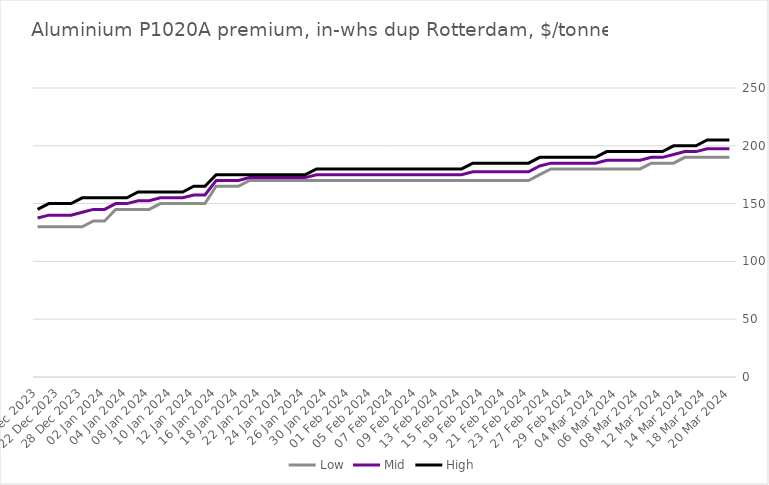
| Category | Low | Mid | High |
|---|---|---|---|
| 20 Mar 2024 | 190 | 197.5 | 205 |
| 19 Mar 2024 | 190 | 197.5 | 205 |
| 18 Mar 2024 | 190 | 197.5 | 205 |
| 15 Mar 2024 | 190 | 195 | 200 |
| 14 Mar 2024 | 190 | 195 | 200 |
| 13 Mar 2024 | 185 | 192.5 | 200 |
| 12 Mar 2024 | 185 | 190 | 195 |
| 11 Mar 2024 | 185 | 190 | 195 |
| 08 Mar 2024 | 180 | 187.5 | 195 |
| 07 Mar 2024 | 180 | 187.5 | 195 |
| 06 Mar 2024 | 180 | 187.5 | 195 |
| 05 Mar 2024 | 180 | 187.5 | 195 |
| 04 Mar 2024 | 180 | 185 | 190 |
| 01 Mar 2024 | 180 | 185 | 190 |
| 29 Feb 2024 | 180 | 185 | 190 |
| 28 Feb 2024 | 180 | 185 | 190 |
| 27 Feb 2024 | 180 | 185 | 190 |
| 26 Feb 2024 | 175 | 182.5 | 190 |
| 23 Feb 2024 | 170 | 177.5 | 185 |
| 22 Feb 2024 | 170 | 177.5 | 185 |
| 21 Feb 2024 | 170 | 177.5 | 185 |
| 20 Feb 2024 | 170 | 177.5 | 185 |
| 19 Feb 2024 | 170 | 177.5 | 185 |
| 16 Feb 2024 | 170 | 177.5 | 185 |
| 15 Feb 2024 | 170 | 175 | 180 |
| 14 Feb 2024 | 170 | 175 | 180 |
| 13 Feb 2024 | 170 | 175 | 180 |
| 12 Feb 2024 | 170 | 175 | 180 |
| 09 Feb 2024 | 170 | 175 | 180 |
| 08 Feb 2024 | 170 | 175 | 180 |
| 07 Feb 2024 | 170 | 175 | 180 |
| 06 Feb 2024 | 170 | 175 | 180 |
| 05 Feb 2024 | 170 | 175 | 180 |
| 02 Feb 2024 | 170 | 175 | 180 |
| 01 Feb 2024 | 170 | 175 | 180 |
| 31 Jan 2024 | 170 | 175 | 180 |
| 30 Jan 2024 | 170 | 175 | 180 |
| 29 Jan 2024 | 170 | 175 | 180 |
| 26 Jan 2024 | 170 | 172.5 | 175 |
| 25 Jan 2024 | 170 | 172.5 | 175 |
| 24 Jan 2024 | 170 | 172.5 | 175 |
| 23 Jan 2024 | 170 | 172.5 | 175 |
| 22 Jan 2024 | 170 | 172.5 | 175 |
| 19 Jan 2024 | 170 | 172.5 | 175 |
| 18 Jan 2024 | 165 | 170 | 175 |
| 17 Jan 2024 | 165 | 170 | 175 |
| 16 Jan 2024 | 165 | 170 | 175 |
| 15 Jan 2024 | 150 | 157.5 | 165 |
| 12 Jan 2024 | 150 | 157.5 | 165 |
| 11 Jan 2024 | 150 | 155 | 160 |
| 10 Jan 2024 | 150 | 155 | 160 |
| 09 Jan 2024 | 150 | 155 | 160 |
| 08 Jan 2024 | 145 | 152.5 | 160 |
| 05 Jan 2024 | 145 | 152.5 | 160 |
| 04 Jan 2024 | 145 | 150 | 155 |
| 03 Jan 2024 | 145 | 150 | 155 |
| 02 Jan 2024 | 135 | 145 | 155 |
| 29 Dec 2023 | 135 | 145 | 155 |
| 28 Dec 2023 | 130 | 142.5 | 155 |
| 27 Dec 2023 | 130 | 140 | 150 |
| 22 Dec 2023 | 130 | 140 | 150 |
| 21 Dec 2023 | 130 | 140 | 150 |
| 20 Dec 2023 | 130 | 137.5 | 145 |